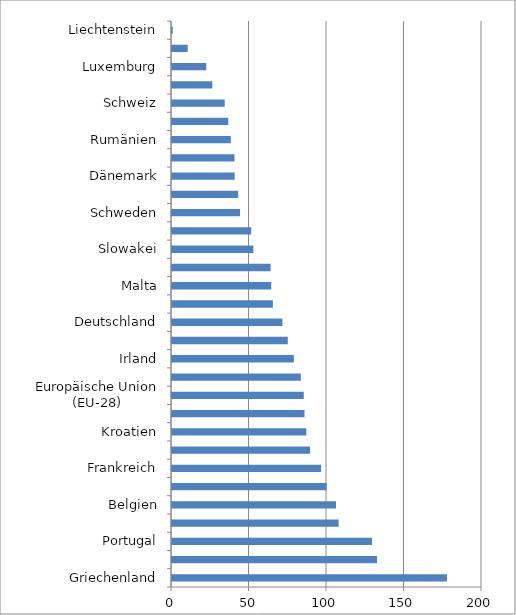
| Category | Series 0 |
|---|---|
| Griechenland | 177.4 |
| Italien | 132.3 |
| Portugal | 129 |
| Zypern | 107.5 |
| Belgien | 105.8 |
| Spanien | 99.8 |
| Frankreich | 96.2 |
| Vereinigtes Königreich | 89.1 |
| Kroatien | 86.7 |
| Österreich | 85.5 |
| Europäische Union (EU-28) | 85 |
| Slowenien | 83.1 |
| Irland | 78.6 |
| Ungarn | 74.7 |
| Deutschland | 71.2 |
| Niederlande | 65.1 |
| Malta | 64 |
| Finnland | 63.6 |
| Slowakei | 52.5 |
| Polen | 51.1 |
| Schweden | 43.9 |
| Litauen | 42.7 |
| Dänemark | 40.4 |
| Tschechien | 40.3 |
| Rumänien | 37.9 |
| Lettland | 36.3 |
| Schweiz | 34 |
| Bulgarien | 26 |
| Luxemburg | 22.1 |
| Estland | 10.1 |
| Liechtenstein | 0.5 |